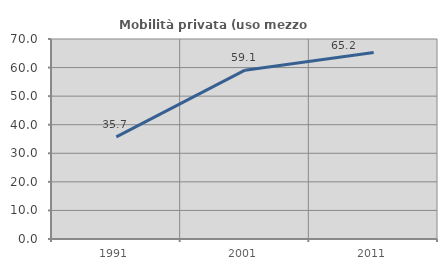
| Category | Mobilità privata (uso mezzo privato) |
|---|---|
| 1991.0 | 35.719 |
| 2001.0 | 59.082 |
| 2011.0 | 65.247 |